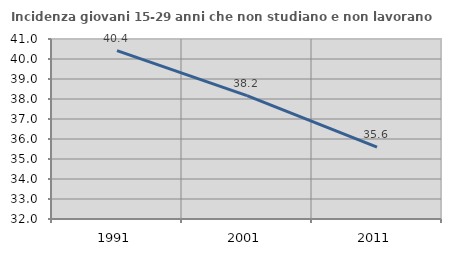
| Category | Incidenza giovani 15-29 anni che non studiano e non lavorano  |
|---|---|
| 1991.0 | 40.417 |
| 2001.0 | 38.171 |
| 2011.0 | 35.591 |